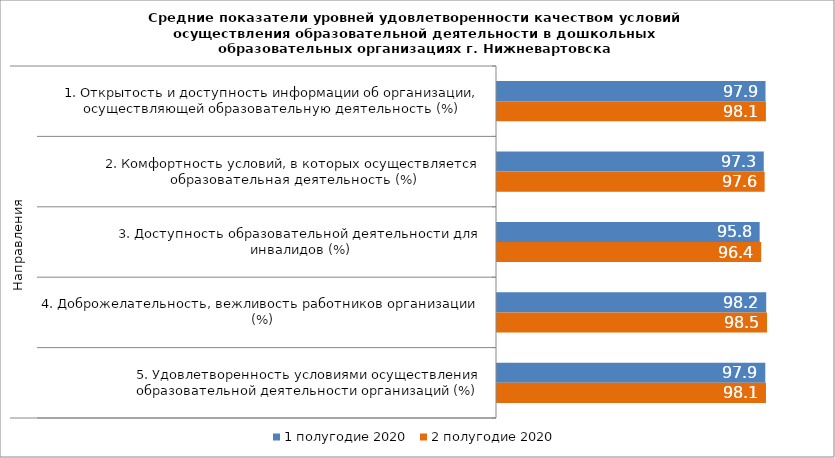
| Category | 1 полугодие 2020 | 2 полугодие 2020 |
|---|---|---|
| 0 | 97.937 | 98.081 |
| 1 | 97.306 | 97.615 |
| 2 | 95.806 | 96.355 |
| 3 | 98.201 | 98.494 |
| 4 | 97.86 | 98.1 |